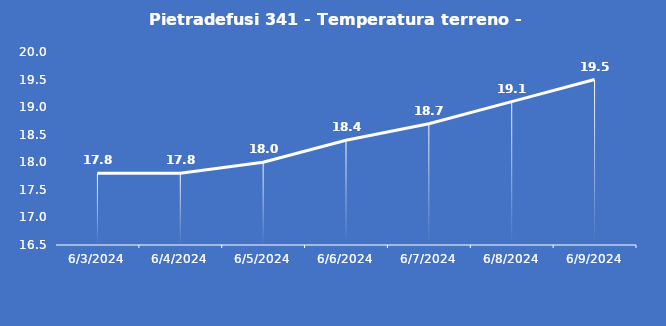
| Category | Pietradefusi 341 - Temperatura terreno - Grezzo (°C) |
|---|---|
| 6/3/24 | 17.8 |
| 6/4/24 | 17.8 |
| 6/5/24 | 18 |
| 6/6/24 | 18.4 |
| 6/7/24 | 18.7 |
| 6/8/24 | 19.1 |
| 6/9/24 | 19.5 |